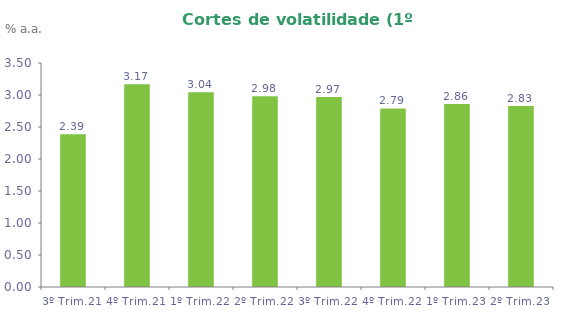
| Category | Series 0 |
|---|---|
| 3º Trim.21 | 2.387 |
| 4º Trim.21 | 3.166 |
| 1º Trim.22 | 3.042 |
| 2º Trim.22 | 2.981 |
| 3º Trim.22 | 2.97 |
| 4º Trim.22 | 2.79 |
| 1º Trim.23 | 2.86 |
| 2º Trim.23 | 2.83 |